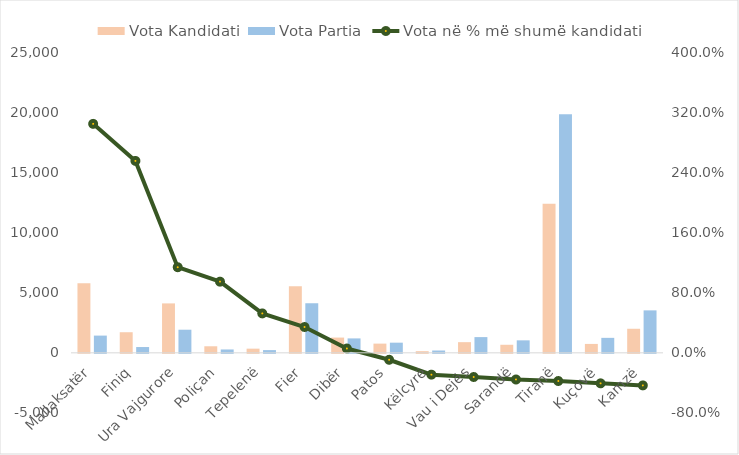
| Category | Vota Kandidati | Vota Partia |
|---|---|---|
| Mallaksatër | 5792 | 1432 |
| Finiq | 1712 | 482 |
| Ura Vajgurore | 4108 | 1921 |
| Poliçan | 545 | 280 |
| Tepelenë | 346 | 227 |
| Fier | 5536 | 4121 |
| Dibër | 1268 | 1199 |
| Patos | 766 | 844 |
| Këlcyrë | 137 | 193 |
| Vau i Dejës | 887 | 1307 |
| Sarandë | 670 | 1038 |
| Tiranë | 12398 | 19827 |
| Kuçovë | 740 | 1245 |
| Kamzë | 2000 | 3528 |